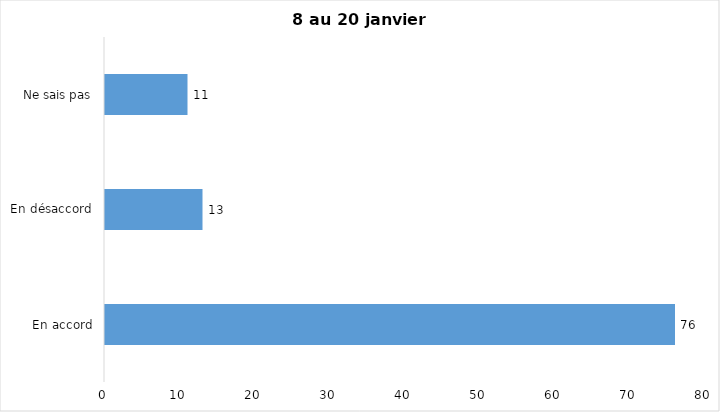
| Category | J’ai l’intention de recevoir le vaccin contre la COVID-19 lorsqu’il
sera disponible |
|---|---|
| En accord | 76 |
| En désaccord | 13 |
| Ne sais pas | 11 |